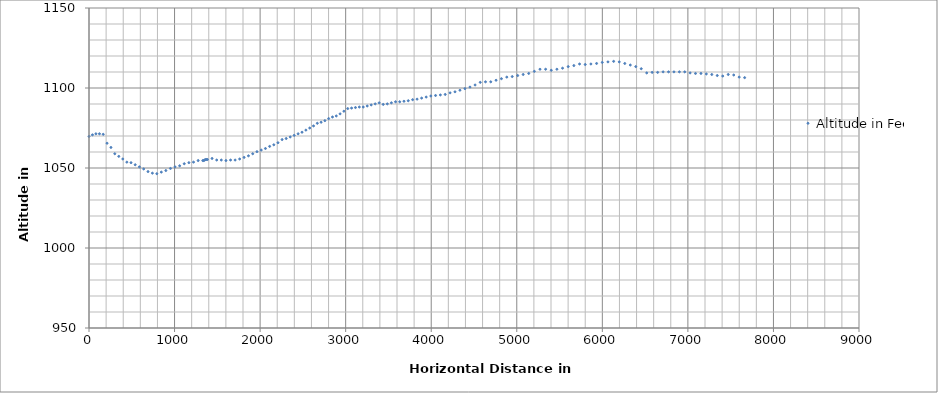
| Category | Altitude in Feet |
|---|---|
| 0.0 | 1069.738 |
| 40.35379996022363 | 1070.723 |
| 80.78508880030682 | 1071.379 |
| 122.20693059522496 | 1071.379 |
| 166.25048010066376 | 1071.051 |
| 211.16531548039936 | 1065.474 |
| 256.47652432957693 | 1062.85 |
| 301.5950804035137 | 1058.913 |
| 348.1892940138186 | 1057.273 |
| 395.180578311744 | 1055.633 |
| 442.665627850779 | 1053.664 |
| 491.0835382172533 | 1053.336 |
| 539.9047605829415 | 1052.024 |
| 589.3096555918615 | 1050.712 |
| 639.117865840982 | 1049.4 |
| 689.8005737107941 | 1047.76 |
| 740.989761676497 | 1046.776 |
| 792.99610348558 | 1046.448 |
| 845.3473125464029 | 1047.432 |
| 898.2822239923685 | 1048.416 |
| 952.0304839100717 | 1049.728 |
| 1005.704626696353 | 1050.712 |
| 1059.5107226003265 | 1051.368 |
| 1113.4487716235874 | 1052.68 |
| 1167.7931610094647 | 1053.336 |
| 1221.5751307283883 | 1053.664 |
| 1275.9060306141093 | 1054.649 |
| 1330.1011633543383 | 1054.649 |
| 1341.1089158198795 | 1054.649 |
| 1351.8354584332862 | 1054.977 |
| 1362.562001048406 | 1055.305 |
| 1373.569753519008 | 1055.305 |
| 1384.2962961376077 | 1055.305 |
| 1438.4914289636995 | 1055.961 |
| 1492.5580200535003 | 1054.977 |
| 1546.6211998778376 | 1054.977 |
| 1600.6843797437045 | 1054.649 |
| 1654.5983028886073 | 1054.977 |
| 1708.116366804 | 1054.977 |
| 1760.8798355341182 | 1055.633 |
| 1812.656852368016 | 1056.617 |
| 1863.6842992178279 | 1057.601 |
| 1913.5435611459097 | 1058.913 |
| 1963.349036344006 | 1060.225 |
| 2013.135494904211 | 1061.209 |
| 2062.19762136382 | 1062.194 |
| 2111.5143496448172 | 1063.506 |
| 2160.282084898127 | 1064.49 |
| 2208.7955515549183 | 1065.802 |
| 2257.1989770742657 | 1067.77 |
| 2304.889865756096 | 1068.426 |
| 2351.927193234087 | 1069.41 |
| 2398.3521367410635 | 1070.395 |
| 2444.2120653716524 | 1071.379 |
| 2489.873652346958 | 1072.363 |
| 2535.0441595122625 | 1073.675 |
| 2579.805222926589 | 1074.987 |
| 2624.416362544273 | 1076.299 |
| 2668.7183175896034 | 1077.939 |
| 2712.9998762282357 | 1078.596 |
| 2757.2062536583007 | 1079.58 |
| 2801.1552858481 | 1080.892 |
| 2845.689721865986 | 1081.876 |
| 2890.351109908465 | 1082.532 |
| 2934.7795359097213 | 1083.844 |
| 2979.442875773171 | 1085.484 |
| 3024.17366074571 | 1087.125 |
| 3069.0317863751775 | 1087.453 |
| 3114.455392599115 | 1087.781 |
| 3159.9278292292342 | 1088.109 |
| 3205.6084201655576 | 1088.109 |
| 3251.9375877621733 | 1088.765 |
| 3298.4211766802887 | 1089.421 |
| 3345.098185083289 | 1090.077 |
| 3391.8254283572373 | 1090.733 |
| 3439.023590891657 | 1089.749 |
| 3486.8046807730993 | 1090.077 |
| 3534.4792442891594 | 1090.733 |
| 3583.195399439723 | 1091.389 |
| 3631.6638502393916 | 1091.389 |
| 3681.448528803612 | 1091.717 |
| 3731.6783671574995 | 1092.045 |
| 3782.8311988977825 | 1092.701 |
| 3834.70761138503 | 1093.029 |
| 3887.790263699397 | 1093.685 |
| 3941.208269695149 | 1094.341 |
| 3995.6577173588257 | 1094.998 |
| 4050.9882037743214 | 1095.326 |
| 4107.059877302921 | 1095.654 |
| 4163.56605322061 | 1095.982 |
| 4220.356103229534 | 1096.966 |
| 4277.89124699858 | 1097.622 |
| 4335.770377069277 | 1098.606 |
| 4394.167006104045 | 1099.59 |
| 4452.953849975794 | 1100.574 |
| 4512.8590094770625 | 1101.886 |
| 4573.208474940253 | 1103.527 |
| 4634.441924589189 | 1103.855 |
| 4695.929202845869 | 1103.855 |
| 4757.992656194542 | 1104.839 |
| 4820.634488190086 | 1105.823 |
| 4883.457080702223 | 1106.807 |
| 4946.790931673585 | 1107.135 |
| 5010.704189631295 | 1107.791 |
| 5074.907665304035 | 1108.447 |
| 5139.806607028957 | 1109.103 |
| 5205.225827932375 | 1110.415 |
| 5271.337445178832 | 1111.728 |
| 5337.045349065119 | 1111.728 |
| 5403.044431721246 | 1111.071 |
| 5469.046010398592 | 1111.728 |
| 5535.157628115191 | 1112.384 |
| 5601.269245949918 | 1113.368 |
| 5667.3833598066585 | 1114.024 |
| 5733.786156535356 | 1115.008 |
| 5800.076418558478 | 1114.68 |
| 5866.36668069935 | 1115.008 |
| 5933.05566463489 | 1115.336 |
| 5999.458461836614 | 1115.992 |
| 6065.8587632534545 | 1116.32 |
| 6132.149025869433 | 1116.648 |
| 6197.741900552993 | 1116.32 |
| 6262.5258135221575 | 1115.336 |
| 6327.134539710661 | 1114.352 |
| 6391.047800046535 | 1113.368 |
| 6454.961060491265 | 1112.056 |
| 6518.763286509119 | 1109.431 |
| 6582.38603983488 | 1109.759 |
| 6646.41721819799 | 1109.759 |
| 6710.1578919864305 | 1110.087 |
| 6773.898565884347 | 1110.087 |
| 6837.232420070169 | 1110.087 |
| 6900.5728703590175 | 1110.087 |
| 6963.039156880539 | 1110.087 |
| 7026.14833664079 | 1109.431 |
| 7088.968327211254 | 1109.103 |
| 7152.591371223714 | 1109.103 |
| 7215.8141915149845 | 1108.775 |
| 7279.554866270669 | 1108.447 |
| 7343.295541135273 | 1107.791 |
| 7407.44406426593 | 1107.463 |
| 7471.474957974554 | 1108.447 |
| 7535.796068430255 | 1108.119 |
| 7599.598296304573 | 1106.807 |
| 7663.511558818095 | 1106.479 |